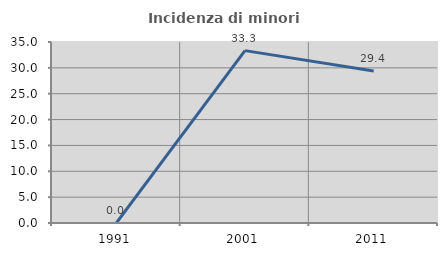
| Category | Incidenza di minori stranieri |
|---|---|
| 1991.0 | 0 |
| 2001.0 | 33.333 |
| 2011.0 | 29.412 |